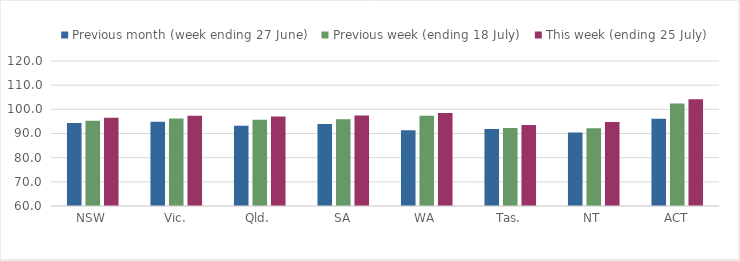
| Category | Previous month (week ending 27 June) | Previous week (ending 18 July) | This week (ending 25 July) |
|---|---|---|---|
| NSW | 94.303 | 95.324 | 96.533 |
| Vic. | 94.887 | 96.156 | 97.299 |
| Qld. | 93.172 | 95.664 | 97.084 |
| SA | 93.91 | 95.909 | 97.411 |
| WA | 91.367 | 97.389 | 98.493 |
| Tas. | 91.898 | 92.287 | 93.498 |
| NT | 90.382 | 92.211 | 94.749 |
| ACT | 96.1 | 102.4 | 104.193 |